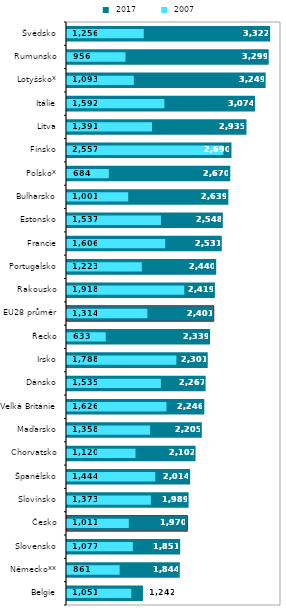
| Category |  2017 |
|---|---|
| Belgie | 1242.209 |
| Německo** | 1844.406 |
| Slovensko | 1850.646 |
| Česko | 1970.488 |
| Slovinsko | 1988.818 |
| Španělsko | 2013.904 |
| Chorvatsko | 2102.431 |
| Maďarsko | 2204.893 |
| Velká Británie | 2245.866 |
| Dánsko | 2267.1 |
| Irsko | 2301.421 |
| Řecko | 2338.816 |
| EU28 průměr | 2401.113 |
| Rakousko | 2418.957 |
| Portugalsko | 2440.373 |
| Francie | 2530.981 |
| Estonsko | 2548.438 |
| Bulharsko | 2639.353 |
| Polsko* | 2670.084 |
| Finsko | 2689.792 |
| Litva | 2935.241 |
| Itálie | 3074.079 |
| Lotyšsko* | 3248.576 |
| Rumunsko | 3298.592 |
| Švédsko | 3321.837 |